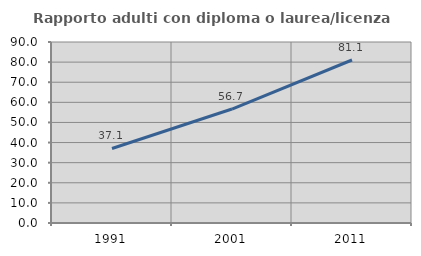
| Category | Rapporto adulti con diploma o laurea/licenza media  |
|---|---|
| 1991.0 | 37.065 |
| 2001.0 | 56.667 |
| 2011.0 | 81.055 |